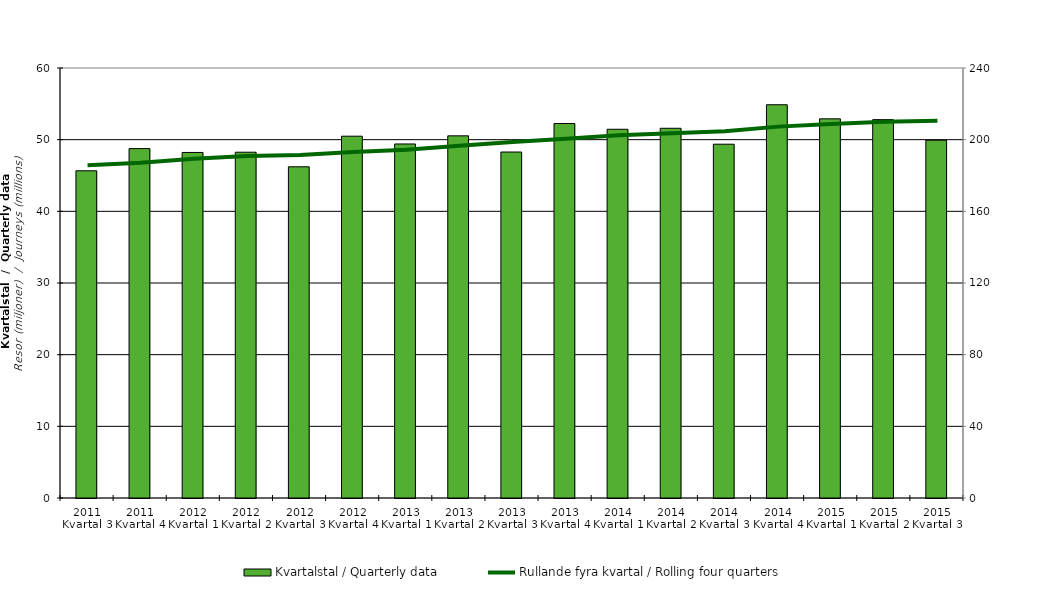
| Category | Kvartalstal / Quarterly data |
|---|---|
| 2011 Kvartal 3 | 45.658 |
| 2011 Kvartal 4 | 48.753 |
| 2012 Kvartal 1 | 48.214 |
| 2012 Kvartal 2 | 48.25 |
| 2012 Kvartal 3 | 46.215 |
| 2012 Kvartal 4 | 50.484 |
| 2013 Kvartal 1 | 49.398 |
| 2013 Kvartal 2 | 50.535 |
| 2013 Kvartal 3 | 48.276 |
| 2013 Kvartal 4 | 52.254 |
| 2014 Kvartal 1 | 51.451 |
| 2014 Kvartal 2 | 51.589 |
| 2014 Kvartal 3 | 49.366 |
| 2014 Kvartal 4 | 54.874 |
| 2015 Kvartal 1 | 52.906 |
| 2015 Kvartal 2 | 52.795 |
| 2015 Kvartal 3 | 49.921 |